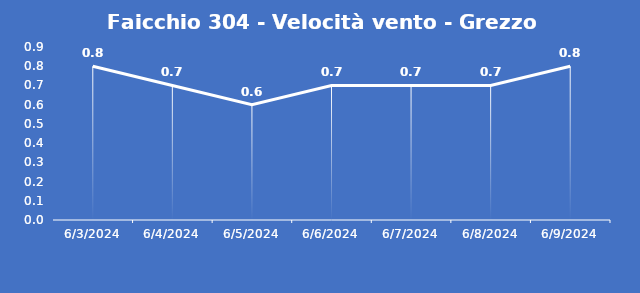
| Category | Faicchio 304 - Velocità vento - Grezzo (m/s) |
|---|---|
| 6/3/24 | 0.8 |
| 6/4/24 | 0.7 |
| 6/5/24 | 0.6 |
| 6/6/24 | 0.7 |
| 6/7/24 | 0.7 |
| 6/8/24 | 0.7 |
| 6/9/24 | 0.8 |